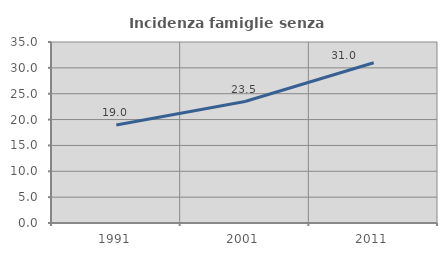
| Category | Incidenza famiglie senza nuclei |
|---|---|
| 1991.0 | 18.969 |
| 2001.0 | 23.493 |
| 2011.0 | 30.991 |